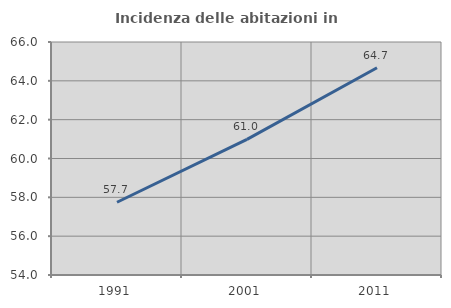
| Category | Incidenza delle abitazioni in proprietà  |
|---|---|
| 1991.0 | 57.748 |
| 2001.0 | 60.987 |
| 2011.0 | 64.674 |